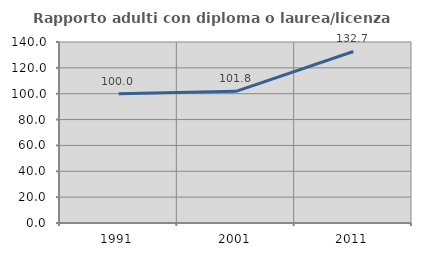
| Category | Rapporto adulti con diploma o laurea/licenza media  |
|---|---|
| 1991.0 | 100 |
| 2001.0 | 101.846 |
| 2011.0 | 132.676 |